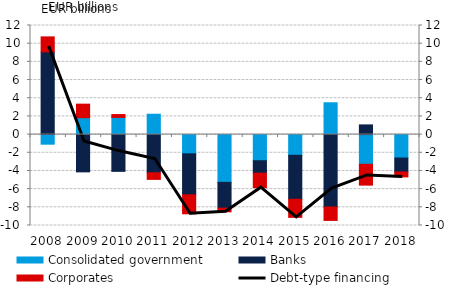
| Category | Consolidated government | Banks | Corporates |
|---|---|---|---|
| 2008.0 | -1.057 | 9.098 | 1.65 |
| 2009.0 | 1.858 | -4.099 | 1.491 |
| 2010.0 | 1.889 | -4.044 | 0.314 |
| 2011.0 | 2.238 | -4.201 | -0.726 |
| 2012.0 | -2.115 | -4.507 | -2.09 |
| 2013.0 | -5.254 | -2.84 | -0.397 |
| 2014.0 | -2.877 | -1.365 | -1.598 |
| 2015.0 | -2.278 | -4.835 | -1.991 |
| 2016.0 | 3.5 | -7.965 | -1.478 |
| 2017.0 | -3.264 | 1.067 | -2.295 |
| 2018.0 | -2.579 | -1.535 | -0.541 |